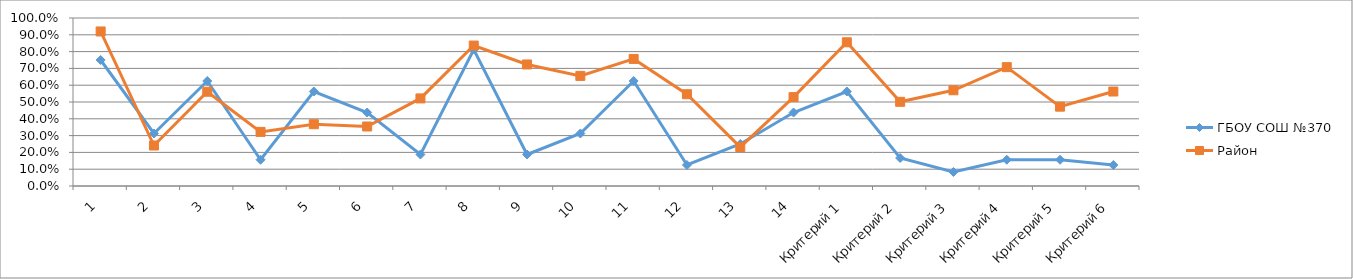
| Category | ГБОУ СОШ №370 | Район |
|---|---|---|
| 1 | 0.75 | 0.92 |
| 2 | 0.312 | 0.241 |
| 3 | 0.625 | 0.561 |
| 4 | 0.156 | 0.322 |
| 5 | 0.562 | 0.368 |
| 6 | 0.438 | 0.354 |
| 7 | 0.188 | 0.521 |
| 8 | 0.812 | 0.836 |
| 9 | 0.188 | 0.723 |
| 10 | 0.312 | 0.655 |
| 11 | 0.625 | 0.756 |
| 12 | 0.125 | 0.546 |
| 13 | 0.25 | 0.232 |
| 14 | 0.438 | 0.529 |
| Критерий 1 | 0.562 | 0.855 |
| Критерий 2 | 0.167 | 0.501 |
| Критерий 3 | 0.083 | 0.57 |
| Критерий 4 | 0.156 | 0.707 |
| Критерий 5 | 0.156 | 0.472 |
| Критерий 6 | 0.125 | 0.562 |